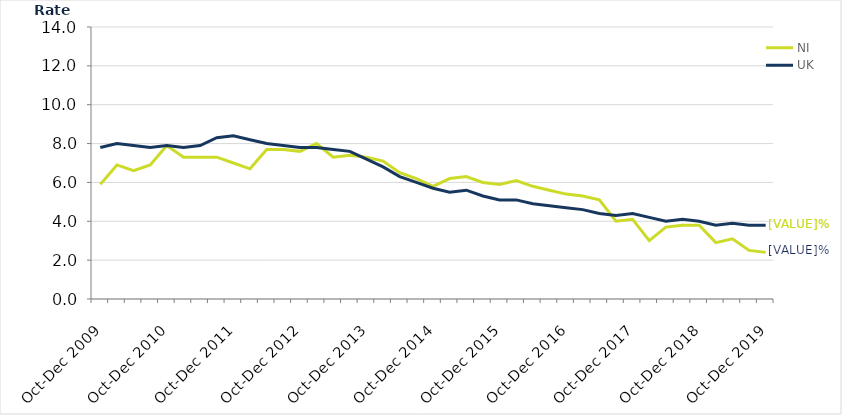
| Category | NI | UK |
|---|---|---|
| Oct-Dec 2009 | 5.9 | 7.8 |
| Jan-Mar 2010 | 6.9 | 8 |
| Apr-Jun 2010 | 6.6 | 7.9 |
| Jul-Sep 2010 | 6.9 | 7.8 |
| Oct-Dec 2010 | 7.9 | 7.9 |
| Jan-Mar 2011 | 7.3 | 7.8 |
| Apr-Jun 2011 | 7.3 | 7.9 |
| Jul-Sep 2011 | 7.3 | 8.3 |
| Oct-Dec 2011 | 7 | 8.4 |
| Jan-Mar 2012 | 6.7 | 8.2 |
| Apr-Jun 2012 | 7.7 | 8 |
| Jul-Sep 2012 | 7.7 | 7.9 |
| Oct-Dec 2012 | 7.6 | 7.8 |
| Jan-Mar 2013 | 8 | 7.8 |
| Apr-Jun 2013 | 7.3 | 7.7 |
| Jul-Sep 2013 | 7.4 | 7.6 |
| Oct-Dec 2013 | 7.3 | 7.2 |
| Jan-Mar 2014 | 7.1 | 6.8 |
| Apr-Jun 2014 | 6.5 | 6.3 |
| Jul-Sep 2014 | 6.2 | 6 |
| Oct-Dec 2014 | 5.8 | 5.7 |
| Jan-Mar 2015 | 6.2 | 5.5 |
| Apr-Jun 2015 | 6.3 | 5.6 |
| Jul-Sep 2015 | 6 | 5.3 |
| Oct-Dec 2015 | 5.9 | 5.1 |
| Jan-Mar 2016 | 6.1 | 5.1 |
| Apr-Jun 2016 | 5.8 | 4.9 |
| Jul-Sep 2016 | 5.6 | 4.8 |
| Oct-Dec 2016 | 5.4 | 4.7 |
| Jan-Mar 2017 | 5.3 | 4.6 |
| Apr-Jun 2017 | 5.1 | 4.4 |
| Jul-Sep 2017 | 4 | 4.3 |
| Oct-Dec 2017 | 4.1 | 4.4 |
| Jan-Mar 2018 | 3 | 4.2 |
| Apr-Jun 2018 | 3.7 | 4 |
| Jul-Sep 2018 | 3.8 | 4.1 |
| Oct-Dec 2018 | 3.8 | 4 |
| Jan-Mar 2019 | 2.9 | 3.8 |
| Apr-Jun 2019 | 3.1 | 3.9 |
| Jul-Sep 2019 | 2.5 | 3.8 |
| Oct-Dec 2019 | 2.4 | 3.8 |